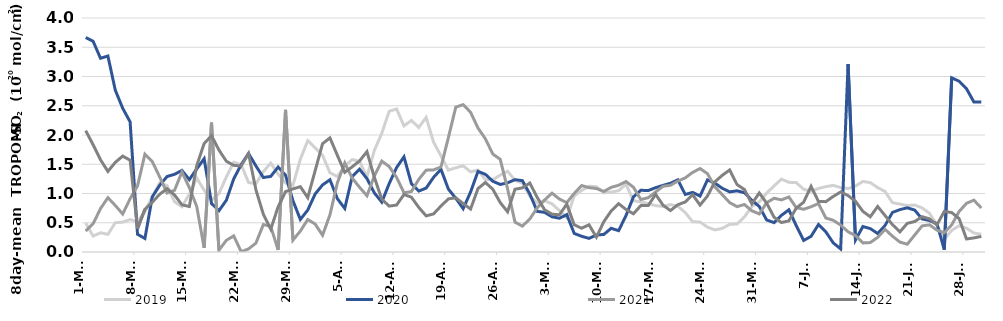
| Category | 2019 | 2020 | 2021 | 2022 |
|---|---|---|---|---|
| 2000-03-01 | 0.495 | 3.666 | 0.357 | 2.074 |
| 2000-03-02 | 0.272 | 3.603 | 0.483 | 1.833 |
| 2000-03-03 | 0.328 | 3.312 | 0.742 | 1.576 |
| 2000-03-04 | 0.302 | 3.35 | 0.928 | 1.378 |
| 2000-03-05 | 0.501 | 2.766 | 0.795 | 1.532 |
| 2000-03-06 | 0.511 | 2.456 | 0.65 | 1.639 |
| 2000-03-07 | 0.554 | 2.224 | 0.911 | 1.571 |
| 2000-03-08 | 0.521 | 0.303 | 1.13 | 0.398 |
| 2000-03-09 | 0.685 | 0.231 | 1.672 | 0.731 |
| 2000-03-10 | 0.95 | 0.943 | 1.545 | 0.852 |
| 2000-03-11 | 1.184 | 1.141 | 1.282 | 0.988 |
| 2000-03-12 | 1.134 | 1.291 | 1.008 | 1.082 |
| 2000-03-13 | 0.86 | 1.328 | 1.054 | 0.975 |
| 2000-03-14 | 0.774 | 1.395 | 1.367 | 0.807 |
| 2000-03-15 | 0.987 | 1.237 | 1.101 | 0.778 |
| 2000-03-16 | 1.262 | 1.42 | 0.779 | 1.477 |
| 2000-03-17 | 1.057 | 1.595 | 0.071 | 1.854 |
| 2000-03-18 | 0.888 | 0.83 | 2.212 | 1.988 |
| 2000-03-19 | 0.999 | 0.706 | 0.031 | 1.743 |
| 2000-03-20 | 1.282 | 0.884 | 0.2 | 1.552 |
| 2000-03-21 | 1.536 | 1.25 | 0.276 | 1.481 |
| 2000-03-22 | 1.494 | 1.493 | 0.005 | 1.471 |
| 2000-03-23 | 1.188 | 1.685 | 0.051 | 1.683 |
| 2000-03-24 | 1.165 | 1.471 | 0.153 | 1.062 |
| 2000-03-25 | 1.374 | 1.273 | 0.468 | 0.646 |
| 2000-03-26 | 1.519 | 1.292 | 0.438 | 0.39 |
| 2000-03-27 | 1.332 | 1.452 | 0.035 | 0.774 |
| 2000-03-28 | 1.18 | 1.313 | 2.43 | 1.032 |
| 2000-03-29 | 1.14 | 0.876 | 0.202 | 1.078 |
| 2000-03-30 | 1.586 | 0.556 | 0.358 | 1.117 |
| 2000-03-31 | 1.904 | 0.717 | 0.556 | 0.929 |
| 2000-04-01 | 1.779 | 0.992 | 0.478 | 1.391 |
| 2000-04-02 | 1.655 | 1.146 | 0.287 | 1.852 |
| 2000-04-03 | 1.354 | 1.235 | 0.635 | 1.95 |
| 2000-04-04 | 1.29 | 0.912 | 1.182 | 1.653 |
| 2000-04-05 | 1.464 | 0.745 | 1.522 | 1.362 |
| 2000-04-06 | 1.581 | 1.287 | 1.265 | 1.455 |
| 2000-04-07 | 1.549 | 1.415 | 1.107 | 1.557 |
| 2000-04-08 | 1.284 | 1.255 | 0.961 | 1.716 |
| 2000-04-09 | 1.737 | 1.01 | 1.302 | 1.276 |
| 2000-04-10 | 2.028 | 0.853 | 1.554 | 0.903 |
| 2000-04-11 | 2.405 | 1.168 | 1.461 | 0.785 |
| 2000-04-12 | 2.444 | 1.443 | 1.276 | 0.802 |
| 2000-04-13 | 2.156 | 1.626 | 1.013 | 0.983 |
| 2000-04-14 | 2.249 | 1.17 | 1.033 | 0.937 |
| 2000-04-15 | 2.129 | 1.041 | 1.242 | 0.762 |
| 2000-04-16 | 2.3 | 1.093 | 1.399 | 0.617 |
| 2000-04-17 | 1.877 | 1.276 | 1.404 | 0.651 |
| 2000-04-18 | 1.642 | 1.414 | 1.453 | 0.785 |
| 2000-04-19 | 1.4 | 1.075 | 1.956 | 0.908 |
| 2000-04-20 | 1.44 | 0.918 | 2.477 | 0.926 |
| 2000-04-21 | 1.473 | 0.74 | 2.518 | 0.829 |
| 2000-04-22 | 1.37 | 1.026 | 2.389 | 0.734 |
| 2000-04-23 | 1.402 | 1.377 | 2.12 | 1.084 |
| 2000-04-24 | 1.235 | 1.328 | 1.935 | 1.188 |
| 2000-04-25 | 1.235 | 1.21 | 1.675 | 1.074 |
| 2000-04-26 | 1.314 | 1.155 | 1.584 | 0.846 |
| 2000-04-27 | 1.38 | 1.183 | 1.079 | 0.688 |
| 2000-04-28 | 1.228 | 1.237 | 0.51 | 1.073 |
| 2000-04-29 | 1.177 | 1.22 | 0.442 | 1.096 |
| 2000-04-30 | 0.955 | 0.992 | 0.565 | 1.179 |
| 2000-05-01 | 0.838 | 0.695 | 0.754 | 0.934 |
| 2000-05-02 | 0.876 | 0.678 | 0.89 | 0.722 |
| 2000-05-03 | 0.823 | 0.602 | 1.006 | 0.647 |
| 2000-05-04 | 0.709 | 0.577 | 0.905 | 0.636 |
| 2000-05-05 | 0.584 | 0.638 | 0.844 | 0.819 |
| 2000-05-06 | 0.959 | 0.318 | 1.001 | 0.465 |
| 2000-05-07 | 1.053 | 0.269 | 1.136 | 0.406 |
| 2000-05-08 | 1.124 | 0.233 | 1.1 | 0.465 |
| 2000-05-09 | 1.117 | 0.29 | 1.085 | 0.254 |
| 2000-05-10 | 1.012 | 0.3 | 1.036 | 0.519 |
| 2000-05-11 | 1.024 | 0.405 | 1.105 | 0.702 |
| 2000-05-12 | 1.049 | 0.365 | 1.141 | 0.826 |
| 2000-05-13 | 1.157 | 0.623 | 1.205 | 0.727 |
| 2000-05-14 | 0.878 | 0.942 | 1.108 | 0.654 |
| 2000-05-15 | 0.852 | 1.055 | 0.897 | 0.793 |
| 2000-05-16 | 0.829 | 1.051 | 0.928 | 0.793 |
| 2000-05-17 | 0.792 | 1.1 | 1.026 | 0.987 |
| 2000-05-18 | 0.779 | 1.139 | 1.124 | 0.799 |
| 2000-05-19 | 0.811 | 1.175 | 1.14 | 0.708 |
| 2000-05-20 | 0.783 | 1.233 | 1.212 | 0.808 |
| 2000-05-21 | 0.674 | 0.984 | 1.267 | 0.855 |
| 2000-05-22 | 0.518 | 1.018 | 1.361 | 0.979 |
| 2000-05-23 | 0.513 | 0.955 | 1.426 | 0.802 |
| 2000-05-24 | 0.425 | 1.232 | 1.34 | 0.956 |
| 2000-05-25 | 0.378 | 1.178 | 1.114 | 1.199 |
| 2000-05-26 | 0.403 | 1.09 | 0.981 | 1.311 |
| 2000-05-27 | 0.472 | 1.027 | 0.845 | 1.402 |
| 2000-05-28 | 0.479 | 1.046 | 0.776 | 1.153 |
| 2000-05-29 | 0.601 | 1.014 | 0.812 | 1.067 |
| 2000-05-30 | 0.778 | 0.884 | 0.703 | 0.822 |
| 2000-05-31 | 0.858 | 0.778 | 0.651 | 1.01 |
| 2000-06-01 | 1.006 | 0.548 | 0.841 | 0.835 |
| 2000-06-02 | 1.13 | 0.503 | 0.919 | 0.595 |
| 2000-06-03 | 1.246 | 0.627 | 0.89 | 0.504 |
| 2000-06-04 | 1.191 | 0.722 | 0.941 | 0.532 |
| 2000-06-05 | 1.186 | 0.45 | 0.758 | 0.75 |
| 2000-06-06 | 1.072 | 0.198 | 0.731 | 0.852 |
| 2000-06-07 | 1.04 | 0.267 | 0.774 | 1.122 |
| 2000-06-08 | 1.086 | 0.47 | 0.828 | 0.864 |
| 2000-06-09 | 1.118 | 0.343 | 0.581 | 0.861 |
| 2000-06-10 | 1.139 | 0.156 | 0.542 | 0.95 |
| 2000-06-11 | 1.101 | 0.052 | 0.46 | 1.027 |
| 2000-06-12 | 1.084 | 3.211 | 0.346 | 0.964 |
| 2000-06-13 | 1.127 | 0.205 | 0.281 | 0.867 |
| 2000-06-14 | 1.206 | 0.436 | 0.155 | 0.695 |
| 2000-06-15 | 1.186 | 0.4 | 0.161 | 0.602 |
| 2000-06-16 | 1.1 | 0.316 | 0.25 | 0.778 |
| 2000-06-17 | 1.034 | 0.454 | 0.388 | 0.623 |
| 2000-06-18 | 0.843 | 0.677 | 0.27 | 0.468 |
| 2000-06-19 | 0.819 | 0.725 | 0.17 | 0.344 |
| 2000-06-20 | 0.794 | 0.756 | 0.133 | 0.49 |
| 2000-06-21 | 0.802 | 0.719 | 0.29 | 0.52 |
| 2000-06-22 | 0.754 | 0.566 | 0.446 | 0.604 |
| 2000-06-23 | 0.662 | 0.536 | 0.465 | 0.567 |
| 2000-06-24 | 0.461 | 0.486 | 0.374 | 0.463 |
| 2000-06-25 | 0.217 | 0.039 | 0.329 | 0.693 |
| 2000-06-26 | 0.37 | 2.977 | 0.463 | 0.674 |
| 2000-06-27 | 0.449 | 2.919 | 0.691 | 0.572 |
| 2000-06-28 | 0.407 | 2.792 | 0.832 | 0.223 |
| 2000-06-29 | 0.324 | 2.564 | 0.886 | 0.241 |
| 2000-06-30 | 0.304 | 2.564 | 0.752 | 0.267 |